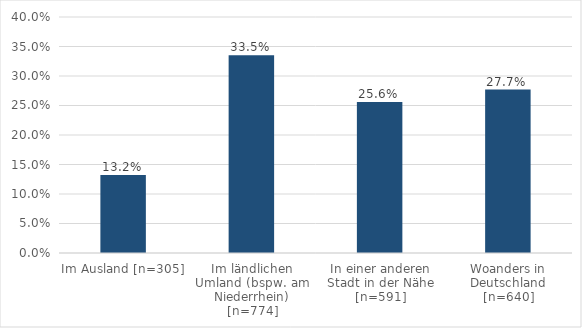
| Category | Series 0 |
|---|---|
| Im Ausland [n=305] | 0.132 |
| Im ländlichen Umland (bspw. am Niederrhein) [n=774] | 0.335 |
| In einer anderen Stadt in der Nähe [n=591] | 0.256 |
| Woanders in Deutschland [n=640] | 0.277 |